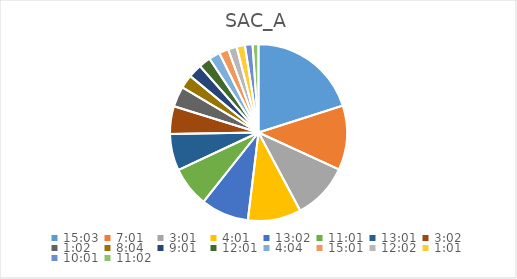
| Category | Series 0 |
|---|---|
| 0.6270833333333333 | 21.963 |
| 0.2923611111111111 | 12.856 |
| 0.12569444444444444 | 11.314 |
| 0.1673611111111111 | 10.642 |
| 0.5430555555555555 | 9.567 |
| 0.4590277777777778 | 8.032 |
| 0.5423611111111112 | 7.321 |
| 0.12638888888888888 | 5.544 |
| 0.04305555555555556 | 4.045 |
| 0.3361111111111111 | 2.733 |
| 0.3756944444444445 | 2.733 |
| 0.5006944444444444 | 2.374 |
| 0.16944444444444443 | 2.232 |
| 0.6256944444444444 | 1.876 |
| 0.5013888888888889 | 1.735 |
| 0.042361111111111106 | 1.664 |
| 0.4173611111111111 | 1.524 |
| 0.4597222222222222 | 1.173 |